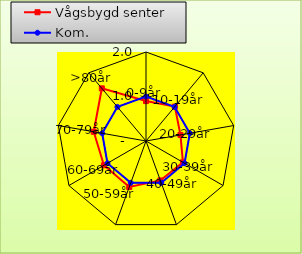
| Category | Vågsbygd senter | Kom. |
|---|---|---|
| 0-9år | 0.897 | 1 |
| 10-19år | 1.009 | 1 |
| 20-29år | 0.786 | 1 |
| 30-39år | 0.958 | 1 |
| 40-49år | 0.943 | 1 |
| 50-59år | 1.101 | 1 |
| 60-69år | 1.092 | 1 |
| 70-79år | 1.193 | 1 |
| >80år | 1.544 | 1 |